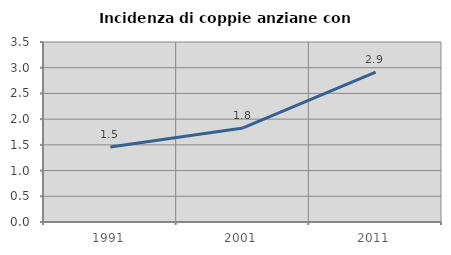
| Category | Incidenza di coppie anziane con figli |
|---|---|
| 1991.0 | 1.46 |
| 2001.0 | 1.829 |
| 2011.0 | 2.913 |